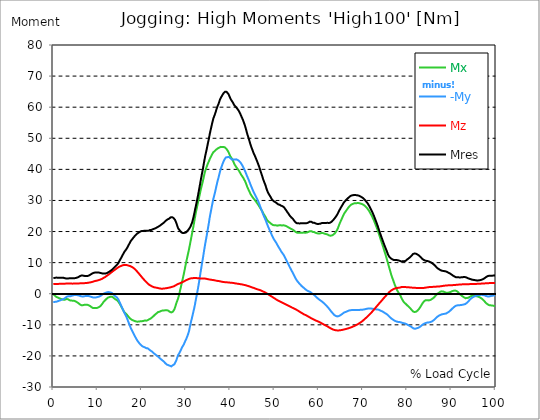
| Category |  Mx |  -My |  Mz |  Mres |
|---|---|---|---|---|
| 0.0 | -0.159 | -2.623 | 3.1 | 5.008 |
| 0.167348456675344 | -0.397 | -2.623 | 3.1 | 5.055 |
| 0.334696913350688 | -0.62 | -2.623 | 3.116 | 5.103 |
| 0.5020453700260321 | -0.827 | -2.607 | 3.132 | 5.167 |
| 0.669393826701376 | -1.017 | -2.575 | 3.132 | 5.198 |
| 0.83674228337672 | -1.145 | -2.496 | 3.148 | 5.167 |
| 1.0040907400520642 | -1.224 | -2.4 | 3.148 | 5.135 |
| 1.1621420602454444 | -1.335 | -2.321 | 3.164 | 5.135 |
| 1.3294905169207885 | -1.463 | -2.242 | 3.179 | 5.151 |
| 1.4968389735961325 | -1.542 | -2.146 | 3.179 | 5.151 |
| 1.6641874302714765 | -1.637 | -2.067 | 3.195 | 5.135 |
| 1.8315358869468206 | -1.717 | -1.971 | 3.195 | 5.135 |
| 1.9988843436221646 | -1.812 | -1.876 | 3.195 | 5.119 |
| 2.1662328002975086 | -1.892 | -1.765 | 3.211 | 5.103 |
| 2.333581256972853 | -1.924 | -1.653 | 3.227 | 5.103 |
| 2.5009297136481967 | -1.939 | -1.542 | 3.227 | 5.071 |
| 2.6682781703235405 | -1.892 | -1.399 | 3.243 | 4.976 |
| 2.8356266269988843 | -1.749 | -1.16 | 3.259 | 4.896 |
| 3.002975083674229 | -1.685 | -0.986 | 3.275 | 4.865 |
| 3.1703235403495724 | -1.717 | -0.89 | 3.275 | 4.88 |
| 3.337671997024917 | -1.78 | -0.827 | 3.275 | 4.896 |
| 3.4957233172182973 | -1.892 | -0.795 | 3.275 | 4.928 |
| 3.663071773893641 | -2.098 | -0.843 | 3.275 | 4.992 |
| 3.8304202305689854 | -2.21 | -0.811 | 3.275 | 5.024 |
| 3.997768687244329 | -2.21 | -0.731 | 3.275 | 4.992 |
| 4.165117143919673 | -2.242 | -0.684 | 3.259 | 4.992 |
| 4.332465600595017 | -2.226 | -0.572 | 3.243 | 4.976 |
| 4.499814057270361 | -2.226 | -0.493 | 3.243 | 4.96 |
| 4.667162513945706 | -2.257 | -0.445 | 3.259 | 4.976 |
| 4.834510970621049 | -2.337 | -0.413 | 3.275 | 5.008 |
| 5.001859427296393 | -2.448 | -0.413 | 3.275 | 5.039 |
| 5.169207883971737 | -2.575 | -0.413 | 3.291 | 5.103 |
| 5.336556340647081 | -2.718 | -0.445 | 3.291 | 5.167 |
| 5.503904797322425 | -2.846 | -0.477 | 3.307 | 5.246 |
| 5.671253253997769 | -3.02 | -0.525 | 3.307 | 5.357 |
| 5.82930457419115 | -3.227 | -0.604 | 3.323 | 5.516 |
| 5.996653030866494 | -3.45 | -0.684 | 3.338 | 5.675 |
| 6.164001487541838 | -3.609 | -0.779 | 3.354 | 5.787 |
| 6.331349944217181 | -3.688 | -0.843 | 3.37 | 5.85 |
| 6.498698400892526 | -3.704 | -0.874 | 3.37 | 5.866 |
| 6.66604685756787 | -3.688 | -0.89 | 3.386 | 5.85 |
| 6.833395314243213 | -3.64 | -0.874 | 3.402 | 5.818 |
| 7.000743770918558 | -3.561 | -0.811 | 3.402 | 5.739 |
| 7.168092227593902 | -3.513 | -0.747 | 3.418 | 5.675 |
| 7.335440684269246 | -3.513 | -0.731 | 3.434 | 5.675 |
| 7.50278914094459 | -3.529 | -0.747 | 3.45 | 5.691 |
| 7.6701375976199335 | -3.545 | -0.731 | 3.481 | 5.691 |
| 7.837486054295278 | -3.609 | -0.747 | 3.513 | 5.739 |
| 7.995537374488658 | -3.72 | -0.763 | 3.561 | 5.834 |
| 8.162885831164003 | -3.831 | -0.795 | 3.593 | 5.946 |
| 8.330234287839346 | -3.974 | -0.874 | 3.64 | 6.105 |
| 8.49758274451469 | -4.149 | -0.97 | 3.688 | 6.264 |
| 8.664931201190035 | -4.356 | -1.065 | 3.752 | 6.407 |
| 8.832279657865378 | -4.531 | -1.16 | 3.815 | 6.55 |
| 8.999628114540721 | -4.626 | -1.192 | 3.895 | 6.661 |
| 9.166976571216066 | -4.626 | -1.176 | 3.974 | 6.74 |
| 9.334325027891412 | -4.61 | -1.176 | 4.054 | 6.788 |
| 9.501673484566755 | -4.61 | -1.192 | 4.117 | 6.804 |
| 9.669021941242098 | -4.626 | -1.176 | 4.165 | 6.836 |
| 9.836370397917442 | -4.594 | -1.129 | 4.213 | 6.852 |
| 10.003718854592787 | -4.515 | -1.065 | 4.26 | 6.836 |
| 10.17106731126813 | -4.372 | -1.002 | 4.34 | 6.82 |
| 10.329118631461512 | -4.276 | -0.938 | 4.419 | 6.788 |
| 10.496467088136853 | -4.133 | -0.827 | 4.483 | 6.74 |
| 10.663815544812199 | -3.943 | -0.684 | 4.578 | 6.677 |
| 10.831164001487544 | -3.656 | -0.525 | 4.674 | 6.613 |
| 10.998512458162887 | -3.354 | -0.35 | 4.785 | 6.55 |
| 11.16586091483823 | -3.02 | -0.175 | 4.912 | 6.502 |
| 11.333209371513574 | -2.655 | 0 | 5.071 | 6.47 |
| 11.50055782818892 | -2.4 | 0.095 | 5.198 | 6.47 |
| 11.667906284864264 | -2.146 | 0.207 | 5.341 | 6.47 |
| 11.835254741539607 | -1.908 | 0.302 | 5.5 | 6.518 |
| 12.00260319821495 | -1.669 | 0.397 | 5.675 | 6.597 |
| 12.169951654890292 | -1.463 | 0.477 | 5.834 | 6.709 |
| 12.337300111565641 | -1.272 | 0.525 | 6.009 | 6.82 |
| 12.504648568240984 | -1.176 | 0.509 | 6.168 | 6.963 |
| 12.662699888434362 | -1.065 | 0.509 | 6.359 | 7.106 |
| 12.830048345109708 | -0.986 | 0.461 | 6.534 | 7.249 |
| 12.997396801785053 | -0.97 | 0.366 | 6.725 | 7.424 |
| 13.164745258460396 | -0.922 | 0.27 | 6.915 | 7.615 |
| 13.33209371513574 | -0.986 | 0.127 | 7.106 | 7.821 |
| 13.499442171811083 | -1.16 | -0.064 | 7.281 | 8.044 |
| 13.666790628486426 | -1.383 | -0.318 | 7.456 | 8.282 |
| 13.834139085161771 | -1.59 | -0.572 | 7.615 | 8.537 |
| 14.001487541837117 | -1.765 | -0.795 | 7.79 | 8.775 |
| 14.16883599851246 | -1.908 | -0.97 | 7.965 | 9.014 |
| 14.336184455187803 | -2.035 | -1.145 | 8.155 | 9.22 |
| 14.503532911863147 | -2.226 | -1.399 | 8.33 | 9.475 |
| 14.670881368538492 | -2.512 | -1.765 | 8.489 | 9.793 |
| 14.828932688731873 | -2.862 | -2.273 | 8.616 | 10.254 |
| 14.996281145407215 | -3.211 | -2.782 | 8.743 | 10.715 |
| 15.163629602082558 | -3.64 | -3.307 | 8.871 | 11.128 |
| 15.330978058757903 | -4.086 | -3.847 | 8.95 | 11.557 |
| 15.498326515433247 | -4.515 | -4.372 | 9.046 | 12.018 |
| 15.665674972108594 | -4.96 | -4.912 | 9.141 | 12.448 |
| 15.833023428783937 | -5.421 | -5.437 | 9.22 | 12.893 |
| 16.00037188545928 | -5.866 | -5.977 | 9.268 | 13.338 |
| 16.167720342134626 | -6.168 | -6.47 | 9.284 | 13.688 |
| 16.335068798809967 | -6.359 | -6.884 | 9.268 | 13.974 |
| 16.502417255485312 | -6.581 | -7.392 | 9.236 | 14.323 |
| 16.669765712160658 | -6.836 | -7.965 | 9.189 | 14.721 |
| 16.837114168836 | -7.138 | -8.585 | 9.125 | 15.15 |
| 17.004462625511344 | -7.424 | -9.205 | 9.046 | 15.595 |
| 17.16251394570472 | -7.71 | -9.825 | 8.982 | 16.056 |
| 17.32986240238007 | -7.965 | -10.429 | 8.902 | 16.501 |
| 17.497210859055414 | -8.187 | -11.033 | 8.807 | 16.931 |
| 17.664559315730756 | -8.314 | -11.51 | 8.68 | 17.233 |
| 17.8319077724061 | -8.426 | -11.987 | 8.569 | 17.551 |
| 17.999256229081443 | -8.553 | -12.463 | 8.41 | 17.869 |
| 18.166604685756788 | -8.68 | -12.94 | 8.235 | 18.155 |
| 18.333953142432133 | -8.759 | -13.433 | 8.044 | 18.457 |
| 18.501301599107478 | -8.823 | -13.862 | 7.821 | 18.711 |
| 18.668650055782823 | -8.902 | -14.276 | 7.567 | 18.965 |
| 18.835998512458165 | -8.966 | -14.705 | 7.313 | 19.204 |
| 19.00334696913351 | -8.998 | -15.102 | 7.042 | 19.411 |
| 19.170695425808855 | -8.934 | -15.42 | 6.788 | 19.554 |
| 19.338043882484197 | -8.934 | -15.754 | 6.486 | 19.728 |
| 19.496095202677576 | -8.902 | -16.04 | 6.2 | 19.872 |
| 19.66344365935292 | -8.871 | -16.311 | 5.914 | 20.015 |
| 19.830792116028263 | -8.855 | -16.549 | 5.628 | 20.126 |
| 19.998140572703612 | -8.855 | -16.756 | 5.341 | 20.205 |
| 20.165489029378953 | -8.807 | -16.883 | 5.071 | 20.205 |
| 20.3328374860543 | -8.759 | -17.058 | 4.785 | 20.253 |
| 20.500185942729644 | -8.664 | -17.137 | 4.515 | 20.221 |
| 20.667534399404985 | -8.616 | -17.233 | 4.26 | 20.205 |
| 20.83488285608033 | -8.664 | -17.376 | 4.006 | 20.285 |
| 21.002231312755672 | -8.664 | -17.503 | 3.768 | 20.348 |
| 21.16957976943102 | -8.6 | -17.535 | 3.513 | 20.285 |
| 21.336928226106362 | -8.505 | -17.566 | 3.291 | 20.237 |
| 21.504276682781704 | -8.362 | -17.741 | 3.068 | 20.269 |
| 21.67162513945705 | -8.203 | -17.948 | 2.877 | 20.348 |
| 21.82967645965043 | -8.092 | -18.186 | 2.75 | 20.492 |
| 21.997024916325774 | -7.965 | -18.33 | 2.607 | 20.555 |
| 22.16437337300112 | -7.806 | -18.409 | 2.464 | 20.523 |
| 22.33172182967646 | -7.599 | -18.616 | 2.337 | 20.603 |
| 22.499070286351806 | -7.376 | -18.918 | 2.226 | 20.746 |
| 22.666418743027148 | -7.17 | -19.108 | 2.13 | 20.841 |
| 22.833767199702496 | -6.947 | -19.299 | 2.051 | 20.921 |
| 23.00111565637784 | -6.693 | -19.474 | 2.003 | 21 |
| 23.168464113053183 | -6.518 | -19.649 | 1.971 | 21.112 |
| 23.335812569728528 | -6.327 | -19.84 | 1.939 | 21.239 |
| 23.50316102640387 | -6.089 | -20.094 | 1.908 | 21.398 |
| 23.670509483079215 | -5.914 | -20.221 | 1.828 | 21.461 |
| 23.83785793975456 | -5.866 | -20.444 | 1.765 | 21.652 |
| 23.995909259947936 | -5.787 | -20.666 | 1.701 | 21.843 |
| 24.163257716623285 | -5.659 | -20.841 | 1.653 | 21.97 |
| 24.330606173298627 | -5.548 | -21.064 | 1.637 | 22.161 |
| 24.49795462997397 | -5.469 | -21.271 | 1.622 | 22.336 |
| 24.665303086649313 | -5.405 | -21.461 | 1.622 | 22.511 |
| 24.83265154332466 | -5.389 | -21.652 | 1.637 | 22.685 |
| 25.0 | -5.373 | -21.843 | 1.685 | 22.86 |
| 25.167348456675345 | -5.357 | -22.097 | 1.701 | 23.115 |
| 25.334696913350694 | -5.326 | -22.383 | 1.733 | 23.369 |
| 25.502045370026035 | -5.294 | -22.59 | 1.765 | 23.576 |
| 25.669393826701377 | -5.294 | -22.781 | 1.812 | 23.782 |
| 25.836742283376722 | -5.357 | -22.892 | 1.86 | 23.925 |
| 26.004090740052067 | -5.453 | -22.972 | 1.908 | 24.037 |
| 26.17143919672741 | -5.644 | -22.987 | 1.955 | 24.132 |
| 26.329490516920792 | -5.834 | -23.162 | 2.003 | 24.355 |
| 26.49683897359613 | -5.93 | -23.289 | 2.067 | 24.561 |
| 26.66418743027148 | -6.009 | -23.369 | 2.146 | 24.657 |
| 26.831535886946828 | -6.025 | -23.274 | 2.21 | 24.625 |
| 26.998884343622166 | -5.802 | -22.987 | 2.273 | 24.402 |
| 27.166232800297514 | -5.58 | -22.924 | 2.369 | 24.37 |
| 27.333581256972852 | -5.103 | -22.733 | 2.448 | 24.164 |
| 27.5009297136482 | -4.451 | -22.272 | 2.591 | 23.766 |
| 27.668278170323543 | -3.704 | -21.827 | 2.734 | 23.242 |
| 27.835626626998888 | -2.941 | -21.302 | 2.893 | 22.654 |
| 28.002975083674233 | -2.305 | -20.555 | 3.005 | 21.906 |
| 28.170323540349575 | -1.685 | -19.824 | 3.116 | 21.175 |
| 28.33767199702492 | -0.858 | -19.442 | 3.211 | 20.81 |
| 28.50502045370026 | 0.079 | -19.061 | 3.291 | 20.492 |
| 28.663071773893645 | 1.176 | -18.6 | 3.402 | 20.19 |
| 28.830420230568986 | 2.146 | -18.107 | 3.481 | 19.887 |
| 28.99776868724433 | 3.259 | -17.566 | 3.609 | 19.681 |
| 29.165117143919673 | 4.276 | -17.042 | 3.736 | 19.474 |
| 29.33246560059502 | 5.278 | -16.708 | 3.815 | 19.506 |
| 29.499814057270367 | 6.407 | -16.263 | 3.943 | 19.538 |
| 29.66716251394571 | 7.535 | -15.738 | 4.07 | 19.585 |
| 29.834510970621054 | 8.743 | -15.198 | 4.213 | 19.617 |
| 30.00185942729639 | 9.936 | -14.689 | 4.34 | 19.728 |
| 30.169207883971744 | 11.017 | -14.101 | 4.435 | 19.983 |
| 30.33655634064708 | 12.13 | -13.513 | 4.547 | 20.237 |
| 30.50390479732243 | 13.195 | -12.829 | 4.658 | 20.507 |
| 30.671253253997772 | 14.276 | -12.05 | 4.753 | 20.81 |
| 30.829304574191156 | 15.5 | -10.906 | 4.849 | 21.112 |
| 30.996653030866494 | 16.708 | -9.809 | 4.912 | 21.588 |
| 31.164001487541842 | 17.948 | -8.743 | 4.96 | 22.208 |
| 31.331349944217187 | 19.22 | -7.821 | 4.992 | 22.749 |
| 31.498698400892525 | 20.428 | -6.788 | 5.008 | 23.544 |
| 31.666046857567874 | 21.652 | -5.739 | 5.024 | 24.529 |
| 31.833395314243212 | 22.987 | -4.737 | 5.055 | 25.595 |
| 32.00074377091856 | 24.402 | -3.609 | 5.071 | 26.787 |
| 32.1680922275939 | 25.722 | -2.273 | 5.055 | 27.868 |
| 32.33544068426925 | 26.898 | -1.049 | 5.039 | 28.997 |
| 32.50278914094459 | 28.043 | 0.207 | 5.008 | 30.125 |
| 32.670137597619934 | 29.092 | 1.447 | 4.976 | 31.333 |
| 32.83748605429528 | 30.173 | 2.846 | 4.96 | 32.621 |
| 33.004834510970625 | 31.254 | 4.26 | 4.944 | 33.909 |
| 33.162885831164004 | 32.399 | 5.818 | 4.928 | 35.244 |
| 33.33023428783935 | 33.496 | 7.345 | 4.912 | 36.58 |
| 33.497582744514695 | 34.481 | 8.791 | 4.88 | 37.851 |
| 33.664931201190036 | 35.435 | 10.238 | 4.865 | 39.107 |
| 33.83227965786538 | 36.389 | 11.589 | 4.865 | 40.284 |
| 33.99962811454073 | 37.518 | 13.115 | 4.865 | 41.714 |
| 34.16697657121607 | 38.583 | 14.641 | 4.865 | 43.066 |
| 34.33432502789141 | 39.489 | 16.04 | 4.865 | 44.29 |
| 34.50167348456676 | 40.188 | 17.344 | 4.833 | 45.387 |
| 34.6690219412421 | 40.84 | 18.632 | 4.769 | 46.468 |
| 34.83637039791744 | 41.508 | 20.062 | 4.721 | 47.66 |
| 35.00371885459279 | 42.096 | 21.398 | 4.658 | 48.773 |
| 35.17106731126814 | 42.589 | 22.797 | 4.594 | 49.87 |
| 35.338415767943474 | 43.209 | 24.37 | 4.578 | 51.173 |
| 35.49646708813686 | 43.702 | 25.674 | 4.547 | 52.302 |
| 35.6638155448122 | 44.163 | 26.882 | 4.499 | 53.335 |
| 35.831164001487544 | 44.655 | 28.09 | 4.451 | 54.384 |
| 35.998512458162885 | 45.116 | 29.299 | 4.419 | 55.402 |
| 36.165860914838234 | 45.514 | 30.475 | 4.388 | 56.34 |
| 36.333209371513576 | 45.72 | 31.365 | 4.356 | 56.96 |
| 36.50055782818892 | 45.895 | 32.319 | 4.308 | 57.612 |
| 36.667906284864266 | 46.07 | 33.337 | 4.245 | 58.295 |
| 36.83525474153961 | 46.372 | 34.418 | 4.197 | 59.106 |
| 37.002603198214956 | 46.611 | 35.451 | 4.149 | 59.821 |
| 37.1699516548903 | 46.738 | 36.468 | 4.117 | 60.489 |
| 37.337300111565646 | 46.817 | 37.263 | 4.086 | 60.982 |
| 37.50464856824098 | 46.992 | 38.265 | 4.038 | 61.713 |
| 37.66269988843437 | 47.135 | 39.219 | 4.006 | 62.397 |
| 37.83004834510971 | 47.231 | 40.029 | 3.958 | 62.937 |
| 37.99739680178505 | 47.215 | 40.729 | 3.879 | 63.366 |
| 38.16474525846039 | 47.199 | 41.396 | 3.831 | 63.764 |
| 38.33209371513574 | 47.215 | 42.048 | 3.799 | 64.193 |
| 38.49944217181109 | 47.199 | 42.605 | 3.768 | 64.527 |
| 38.666790628486424 | 47.119 | 43.113 | 3.736 | 64.797 |
| 38.83413908516178 | 47.024 | 43.479 | 3.704 | 64.972 |
| 39.001487541837115 | 46.849 | 43.813 | 3.672 | 65.067 |
| 39.16883599851246 | 46.531 | 43.956 | 3.672 | 64.924 |
| 39.336184455187805 | 46.166 | 43.924 | 3.656 | 64.606 |
| 39.503532911863154 | 45.816 | 44.019 | 3.64 | 64.384 |
| 39.670881368538495 | 45.355 | 44.004 | 3.625 | 64.018 |
| 39.83822982521384 | 44.783 | 43.829 | 3.577 | 63.446 |
| 39.996281145407224 | 44.242 | 43.622 | 3.545 | 62.89 |
| 40.163629602082565 | 43.861 | 43.352 | 3.513 | 62.429 |
| 40.33097805875791 | 43.527 | 43.193 | 3.513 | 62.047 |
| 40.498326515433256 | 43.113 | 43.129 | 3.497 | 61.681 |
| 40.6656749721086 | 42.573 | 43.209 | 3.466 | 61.3 |
| 40.83302342878393 | 42.016 | 43.161 | 3.418 | 60.839 |
| 41.00037188545929 | 41.54 | 43.161 | 3.37 | 60.473 |
| 41.16772034213463 | 41.11 | 43.241 | 3.323 | 60.219 |
| 41.33506879880997 | 40.776 | 43.225 | 3.275 | 59.949 |
| 41.50241725548531 | 40.443 | 43.161 | 3.259 | 59.662 |
| 41.66976571216066 | 40.125 | 43.034 | 3.227 | 59.36 |
| 41.837114168836 | 39.823 | 42.875 | 3.179 | 59.011 |
| 42.004462625511344 | 39.457 | 42.684 | 3.132 | 58.613 |
| 42.17181108218669 | 39.028 | 42.446 | 3.1 | 58.136 |
| 42.32986240238007 | 38.614 | 42.16 | 3.068 | 57.643 |
| 42.497210859055414 | 38.185 | 41.794 | 3.036 | 57.071 |
| 42.66455931573076 | 37.867 | 41.396 | 2.989 | 56.547 |
| 42.831907772406105 | 37.518 | 40.999 | 2.941 | 56.022 |
| 42.999256229081446 | 37.136 | 40.506 | 2.877 | 55.386 |
| 43.16660468575679 | 36.659 | 39.997 | 2.83 | 54.687 |
| 43.33395314243214 | 36.246 | 39.489 | 2.782 | 54.019 |
| 43.50130159910748 | 35.658 | 38.885 | 2.734 | 53.176 |
| 43.66865005578282 | 35.038 | 38.312 | 2.655 | 52.318 |
| 43.83599851245817 | 34.386 | 37.708 | 2.575 | 51.428 |
| 44.00334696913351 | 33.845 | 37.184 | 2.496 | 50.68 |
| 44.17069542580886 | 33.337 | 36.611 | 2.416 | 49.917 |
| 44.3380438824842 | 32.828 | 36.023 | 2.353 | 49.123 |
| 44.49609520267758 | 32.319 | 35.387 | 2.273 | 48.312 |
| 44.66344365935292 | 31.842 | 34.783 | 2.178 | 47.565 |
| 44.83079211602827 | 31.477 | 34.227 | 2.067 | 46.913 |
| 44.99814057270361 | 31.175 | 33.639 | 1.987 | 46.293 |
| 45.16548902937895 | 30.809 | 33.082 | 1.924 | 45.641 |
| 45.332837486054295 | 30.491 | 32.589 | 1.86 | 45.053 |
| 45.500185942729644 | 30.237 | 32.112 | 1.749 | 44.544 |
| 45.66753439940499 | 29.935 | 31.651 | 1.669 | 44.004 |
| 45.83488285608033 | 29.601 | 31.175 | 1.574 | 43.415 |
| 46.00223131275568 | 29.267 | 30.682 | 1.478 | 42.827 |
| 46.16957976943102 | 28.933 | 30.173 | 1.399 | 42.239 |
| 46.336928226106366 | 28.567 | 29.648 | 1.335 | 41.603 |
| 46.50427668278171 | 28.202 | 29.092 | 1.256 | 40.967 |
| 46.671625139457056 | 27.82 | 28.456 | 1.192 | 40.236 |
| 46.829676459650436 | 27.423 | 27.788 | 1.113 | 39.489 |
| 46.99702491632577 | 27.105 | 27.153 | 1.017 | 38.789 |
| 47.16437337300112 | 26.691 | 26.533 | 0.906 | 38.058 |
| 47.33172182967646 | 26.215 | 25.897 | 0.779 | 37.295 |
| 47.49907028635181 | 25.769 | 25.293 | 0.684 | 36.58 |
| 47.66641874302716 | 25.372 | 24.72 | 0.556 | 35.928 |
| 47.83376719970249 | 25.006 | 24.212 | 0.445 | 35.355 |
| 48.001115656377834 | 24.577 | 23.671 | 0.318 | 34.72 |
| 48.16846411305319 | 24.068 | 23.019 | 0.159 | 33.909 |
| 48.33581256972853 | 23.655 | 22.383 | 0.032 | 33.209 |
| 48.50316102640387 | 23.369 | 21.779 | -0.111 | 32.653 |
| 48.67050948307921 | 23.178 | 21.223 | -0.254 | 32.192 |
| 48.837857939754564 | 22.987 | 20.682 | -0.413 | 31.779 |
| 49.005206396429905 | 22.813 | 20.158 | -0.572 | 31.397 |
| 49.163257716623285 | 22.606 | 19.617 | -0.715 | 30.984 |
| 49.33060617329863 | 22.383 | 19.061 | -0.874 | 30.539 |
| 49.49795462997397 | 22.224 | 18.536 | -1.017 | 30.173 |
| 49.66530308664932 | 22.097 | 18.043 | -1.176 | 29.919 |
| 49.832651543324666 | 22.018 | 17.614 | -1.335 | 29.744 |
| 50.0 | 22.002 | 17.217 | -1.478 | 29.601 |
| 50.16734845667534 | 22.002 | 16.851 | -1.637 | 29.474 |
| 50.33469691335069 | 22.002 | 16.533 | -1.796 | 29.362 |
| 50.50204537002604 | 21.938 | 16.136 | -1.955 | 29.14 |
| 50.66939382670139 | 21.891 | 15.659 | -2.098 | 28.901 |
| 50.836742283376715 | 21.891 | 15.23 | -2.21 | 28.726 |
| 51.00409074005207 | 22.002 | 14.848 | -2.337 | 28.679 |
| 51.17143919672741 | 22.034 | 14.451 | -2.448 | 28.615 |
| 51.32949051692079 | 22.065 | 14.085 | -2.575 | 28.567 |
| 51.496838973596134 | 21.97 | 13.624 | -2.687 | 28.313 |
| 51.66418743027148 | 21.954 | 13.29 | -2.814 | 28.202 |
| 51.831535886946824 | 22.018 | 12.972 | -2.925 | 28.122 |
| 51.99888434362217 | 22.018 | 12.622 | -3.052 | 27.963 |
| 52.16623280029752 | 22.018 | 12.257 | -3.164 | 27.788 |
| 52.33358125697285 | 21.922 | 11.732 | -3.291 | 27.423 |
| 52.5009297136482 | 21.859 | 11.303 | -3.402 | 27.137 |
| 52.668278170323546 | 21.732 | 10.81 | -3.529 | 26.771 |
| 52.835626626998895 | 21.588 | 10.333 | -3.64 | 26.374 |
| 53.00297508367424 | 21.477 | 9.904 | -3.752 | 26.071 |
| 53.17032354034958 | 21.35 | 9.427 | -3.879 | 25.738 |
| 53.33767199702492 | 21.191 | 8.887 | -3.99 | 25.356 |
| 53.50502045370027 | 21.032 | 8.41 | -4.101 | 25.022 |
| 53.663071773893655 | 20.921 | 7.949 | -4.229 | 24.752 |
| 53.83042023056899 | 20.794 | 7.488 | -4.356 | 24.498 |
| 53.99776868724433 | 20.698 | 7.074 | -4.483 | 24.291 |
| 54.16511714391967 | 20.587 | 6.661 | -4.594 | 24.068 |
| 54.33246560059503 | 20.396 | 6.152 | -4.706 | 23.719 |
| 54.49981405727037 | 20.253 | 5.707 | -4.801 | 23.448 |
| 54.667162513945705 | 19.999 | 5.214 | -4.944 | 23.099 |
| 54.834510970621054 | 19.808 | 4.769 | -5.071 | 22.844 |
| 55.0018594272964 | 19.681 | 4.388 | -5.183 | 22.701 |
| 55.169207883971744 | 19.617 | 4.054 | -5.326 | 22.654 |
| 55.336556340647086 | 19.585 | 3.736 | -5.469 | 22.638 |
| 55.50390479732243 | 19.57 | 3.466 | -5.628 | 22.606 |
| 55.671253253997776 | 19.585 | 3.195 | -5.771 | 22.622 |
| 55.83860171067312 | 19.649 | 2.941 | -5.914 | 22.654 |
| 55.9966530308665 | 19.649 | 2.671 | -6.057 | 22.638 |
| 56.16400148754184 | 19.633 | 2.432 | -6.2 | 22.622 |
| 56.33134994421718 | 19.633 | 2.21 | -6.343 | 22.638 |
| 56.498698400892536 | 19.665 | 2.035 | -6.502 | 22.669 |
| 56.66604685756788 | 19.665 | 1.812 | -6.629 | 22.654 |
| 56.83339531424321 | 19.649 | 1.622 | -6.74 | 22.669 |
| 57.00074377091856 | 19.617 | 1.431 | -6.852 | 22.654 |
| 57.16809222759391 | 19.633 | 1.208 | -6.963 | 22.669 |
| 57.33544068426925 | 19.697 | 1.033 | -7.09 | 22.717 |
| 57.5027891409446 | 19.744 | 0.906 | -7.233 | 22.765 |
| 57.670137597619934 | 19.872 | 0.827 | -7.36 | 22.908 |
| 57.83748605429528 | 20.015 | 0.731 | -7.504 | 23.083 |
| 58.004834510970625 | 20.126 | 0.62 | -7.631 | 23.194 |
| 58.16288583116401 | 20.19 | 0.477 | -7.758 | 23.242 |
| 58.330234287839346 | 20.126 | 0.223 | -7.901 | 23.131 |
| 58.497582744514695 | 20.015 | 0.064 | -8.028 | 23.019 |
| 58.66493120119004 | 19.872 | -0.127 | -8.155 | 22.828 |
| 58.832279657865385 | 19.856 | -0.254 | -8.267 | 22.828 |
| 58.999628114540734 | 19.808 | -0.397 | -8.394 | 22.813 |
| 59.16697657121607 | 19.713 | -0.636 | -8.505 | 22.717 |
| 59.33432502789142 | 19.585 | -0.906 | -8.616 | 22.574 |
| 59.50167348456676 | 19.506 | -1.129 | -8.712 | 22.511 |
| 59.66902194124211 | 19.426 | -1.335 | -8.807 | 22.463 |
| 59.83637039791745 | 19.379 | -1.558 | -8.918 | 22.463 |
| 60.00371885459278 | 19.363 | -1.749 | -9.014 | 22.463 |
| 60.17106731126813 | 19.363 | -1.924 | -9.125 | 22.463 |
| 60.33841576794349 | 19.411 | -2.114 | -9.252 | 22.511 |
| 60.49646708813685 | 19.474 | -2.273 | -9.379 | 22.606 |
| 60.6638155448122 | 19.538 | -2.4 | -9.522 | 22.717 |
| 60.831164001487544 | 19.538 | -2.623 | -9.65 | 22.781 |
| 60.99851245816289 | 19.49 | -2.83 | -9.777 | 22.781 |
| 61.16586091483824 | 19.411 | -3.036 | -9.904 | 22.749 |
| 61.333209371513576 | 19.315 | -3.259 | -10.031 | 22.733 |
| 61.50055782818892 | 19.252 | -3.481 | -10.158 | 22.749 |
| 61.667906284864266 | 19.204 | -3.72 | -10.286 | 22.781 |
| 61.835254741539615 | 19.156 | -3.974 | -10.413 | 22.813 |
| 62.002603198214956 | 19.029 | -4.245 | -10.54 | 22.797 |
| 62.16995165489029 | 18.918 | -4.531 | -10.683 | 22.781 |
| 62.33730011156564 | 18.775 | -4.817 | -10.826 | 22.765 |
| 62.504648568240995 | 18.663 | -5.119 | -10.985 | 22.797 |
| 62.67199702491633 | 18.663 | -5.421 | -11.112 | 22.908 |
| 62.83004834510971 | 18.663 | -5.755 | -11.239 | 23.067 |
| 62.99739680178505 | 18.759 | -6.009 | -11.351 | 23.274 |
| 63.1647452584604 | 18.87 | -6.264 | -11.462 | 23.512 |
| 63.33209371513575 | 19.029 | -6.581 | -11.557 | 23.798 |
| 63.4994421718111 | 19.22 | -6.836 | -11.637 | 24.068 |
| 63.666790628486424 | 19.474 | -6.995 | -11.7 | 24.37 |
| 63.83413908516177 | 19.792 | -7.122 | -11.748 | 24.688 |
| 64.00148754183712 | 20.158 | -7.233 | -11.78 | 25.038 |
| 64.16883599851248 | 20.539 | -7.297 | -11.812 | 25.404 |
| 64.3361844551878 | 21.064 | -7.281 | -11.828 | 25.849 |
| 64.50353291186315 | 21.716 | -7.201 | -11.812 | 26.358 |
| 64.6708813685385 | 22.336 | -7.106 | -11.78 | 26.835 |
| 64.83822982521384 | 22.908 | -6.979 | -11.748 | 27.264 |
| 65.00557828188919 | 23.433 | -6.82 | -11.716 | 27.677 |
| 65.16362960208257 | 23.957 | -6.661 | -11.684 | 28.09 |
| 65.3309780587579 | 24.466 | -6.486 | -11.637 | 28.472 |
| 65.49832651543326 | 25.038 | -6.295 | -11.573 | 28.901 |
| 65.6656749721086 | 25.547 | -6.12 | -11.51 | 29.299 |
| 65.83302342878395 | 25.944 | -5.977 | -11.462 | 29.569 |
| 66.00037188545929 | 26.294 | -5.898 | -11.398 | 29.855 |
| 66.16772034213463 | 26.628 | -5.818 | -11.335 | 30.093 |
| 66.33506879880998 | 26.962 | -5.723 | -11.271 | 30.332 |
| 66.50241725548531 | 27.311 | -5.596 | -11.192 | 30.586 |
| 66.66976571216065 | 27.645 | -5.485 | -11.128 | 30.809 |
| 66.83711416883601 | 27.931 | -5.405 | -11.049 | 31.031 |
| 67.00446262551135 | 28.202 | -5.357 | -10.969 | 31.238 |
| 67.1718110821867 | 28.456 | -5.294 | -10.906 | 31.429 |
| 67.32986240238007 | 28.647 | -5.278 | -10.81 | 31.556 |
| 67.49721085905541 | 28.774 | -5.262 | -10.715 | 31.636 |
| 67.66455931573076 | 28.869 | -5.23 | -10.603 | 31.667 |
| 67.83190777240611 | 28.981 | -5.198 | -10.524 | 31.731 |
| 67.99925622908145 | 29.06 | -5.214 | -10.413 | 31.763 |
| 68.16660468575678 | 29.076 | -5.23 | -10.317 | 31.763 |
| 68.33395314243214 | 29.108 | -5.214 | -10.19 | 31.731 |
| 68.50130159910749 | 29.108 | -5.198 | -10.063 | 31.683 |
| 68.66865005578282 | 29.14 | -5.214 | -9.936 | 31.667 |
| 68.83599851245816 | 29.14 | -5.214 | -9.793 | 31.62 |
| 69.00334696913352 | 29.156 | -5.214 | -9.666 | 31.572 |
| 69.17069542580886 | 29.14 | -5.214 | -9.522 | 31.508 |
| 69.3380438824842 | 29.06 | -5.183 | -9.348 | 31.365 |
| 69.50539233915956 | 28.981 | -5.167 | -9.189 | 31.238 |
| 69.66344365935292 | 28.901 | -5.151 | -9.03 | 31.095 |
| 69.83079211602826 | 28.822 | -5.135 | -8.855 | 30.952 |
| 69.99814057270362 | 28.71 | -5.103 | -8.664 | 30.777 |
| 70.16548902937896 | 28.536 | -5.087 | -8.457 | 30.555 |
| 70.33283748605429 | 28.377 | -5.024 | -8.219 | 30.332 |
| 70.50018594272964 | 28.186 | -4.976 | -7.996 | 30.093 |
| 70.667534399405 | 27.931 | -4.912 | -7.806 | 29.791 |
| 70.83488285608033 | 27.677 | -4.849 | -7.599 | 29.489 |
| 71.00223131275568 | 27.407 | -4.785 | -7.376 | 29.171 |
| 71.16957976943102 | 27.073 | -4.769 | -7.154 | 28.822 |
| 71.33692822610637 | 26.739 | -4.737 | -6.915 | 28.424 |
| 71.50427668278171 | 26.358 | -4.737 | -6.677 | 28.011 |
| 71.67162513945706 | 25.944 | -4.753 | -6.438 | 27.566 |
| 71.8389735961324 | 25.483 | -4.769 | -6.184 | 27.073 |
| 71.99702491632577 | 25.022 | -4.785 | -5.914 | 26.564 |
| 72.16437337300113 | 24.545 | -4.833 | -5.659 | 26.071 |
| 72.33172182967647 | 24.021 | -4.865 | -5.373 | 25.515 |
| 72.49907028635181 | 23.496 | -4.896 | -5.103 | 24.959 |
| 72.66641874302715 | 22.908 | -4.944 | -4.817 | 24.339 |
| 72.8337671997025 | 22.288 | -4.976 | -4.531 | 23.719 |
| 73.00111565637783 | 21.684 | -5.024 | -4.245 | 23.099 |
| 73.16846411305319 | 21.064 | -5.071 | -3.958 | 22.479 |
| 73.33581256972853 | 20.396 | -5.087 | -3.688 | 21.795 |
| 73.50316102640387 | 19.681 | -5.119 | -3.418 | 21.064 |
| 73.67050948307921 | 18.95 | -5.23 | -3.132 | 20.333 |
| 73.83785793975457 | 18.234 | -5.357 | -2.877 | 19.649 |
| 74.00520639642991 | 17.503 | -5.453 | -2.607 | 18.95 |
| 74.16325771662328 | 16.772 | -5.564 | -2.337 | 18.266 |
| 74.33060617329863 | 16.088 | -5.659 | -2.067 | 17.63 |
| 74.49795462997398 | 15.373 | -5.771 | -1.78 | 16.978 |
| 74.66530308664932 | 14.562 | -5.93 | -1.478 | 16.311 |
| 74.83265154332466 | 13.783 | -6.089 | -1.208 | 15.691 |
| 75.00000000000001 | 13.052 | -6.232 | -0.954 | 15.086 |
| 75.16734845667534 | 12.289 | -6.391 | -0.668 | 14.498 |
| 75.3346969133507 | 11.478 | -6.55 | -0.413 | 13.894 |
| 75.50204537002605 | 10.619 | -6.709 | -0.143 | 13.242 |
| 75.66939382670138 | 9.761 | -6.915 | 0.095 | 12.638 |
| 75.83674228337672 | 8.934 | -7.138 | 0.35 | 12.177 |
| 76.00409074005208 | 8.092 | -7.392 | 0.588 | 11.796 |
| 76.17143919672742 | 7.249 | -7.631 | 0.795 | 11.526 |
| 76.33878765340276 | 6.422 | -7.853 | 0.986 | 11.335 |
| 76.49683897359614 | 5.644 | -8.06 | 1.145 | 11.16 |
| 76.66418743027148 | 4.992 | -8.219 | 1.288 | 11.064 |
| 76.83153588694682 | 4.372 | -8.362 | 1.415 | 10.953 |
| 76.99888434362218 | 3.672 | -8.505 | 1.542 | 10.81 |
| 77.16623280029752 | 2.989 | -8.68 | 1.669 | 10.778 |
| 77.33358125697285 | 2.432 | -8.807 | 1.749 | 10.826 |
| 77.5009297136482 | 1.892 | -8.887 | 1.796 | 10.858 |
| 77.66827817032356 | 1.319 | -8.966 | 1.844 | 10.826 |
| 77.83562662699889 | 0.843 | -9.03 | 1.908 | 10.762 |
| 78.00297508367423 | 0.477 | -9.061 | 1.924 | 10.731 |
| 78.17032354034959 | 0.048 | -9.125 | 1.971 | 10.715 |
| 78.33767199702493 | -0.175 | -9.046 | 1.971 | 10.572 |
| 78.50502045370027 | -0.652 | -9.141 | 2.035 | 10.492 |
| 78.67236891037561 | -1.256 | -9.284 | 2.13 | 10.381 |
| 78.83042023056899 | -1.749 | -9.348 | 2.162 | 10.413 |
| 78.99776868724433 | -2.13 | -9.411 | 2.162 | 10.429 |
| 79.16511714391969 | -2.512 | -9.475 | 2.178 | 10.429 |
| 79.33246560059503 | -2.846 | -9.538 | 2.178 | 10.429 |
| 79.49981405727036 | -3.02 | -9.57 | 2.162 | 10.476 |
| 79.66716251394571 | -3.243 | -9.634 | 2.13 | 10.588 |
| 79.83451097062107 | -3.481 | -9.777 | 2.114 | 10.794 |
| 80.00185942729641 | -3.736 | -9.952 | 2.098 | 11.033 |
| 80.16920788397174 | -3.895 | -10.047 | 2.083 | 11.192 |
| 80.33655634064709 | -4.133 | -10.158 | 2.067 | 11.367 |
| 80.50390479732243 | -4.372 | -10.286 | 2.035 | 11.557 |
| 80.67125325399778 | -4.626 | -10.413 | 2.019 | 11.764 |
| 80.83860171067312 | -4.896 | -10.556 | 2.003 | 11.987 |
| 80.99665303086651 | -5.183 | -10.731 | 1.971 | 12.241 |
| 81.16400148754184 | -5.437 | -10.906 | 1.955 | 12.511 |
| 81.3313499442172 | -5.707 | -11.096 | 1.939 | 12.797 |
| 81.49869840089255 | -5.882 | -11.192 | 1.924 | 12.924 |
| 81.66604685756786 | -5.882 | -11.223 | 1.908 | 12.94 |
| 81.83339531424322 | -5.914 | -11.271 | 1.876 | 12.972 |
| 82.00074377091858 | -5.787 | -11.192 | 1.876 | 12.877 |
| 82.16809222759392 | -5.596 | -11.096 | 1.876 | 12.734 |
| 82.33544068426926 | -5.437 | -11.049 | 1.86 | 12.622 |
| 82.50278914094459 | -5.167 | -10.969 | 1.844 | 12.479 |
| 82.67013759761994 | -4.896 | -10.858 | 1.844 | 12.289 |
| 82.83748605429528 | -4.547 | -10.699 | 1.844 | 12.066 |
| 83.00483451097062 | -4.229 | -10.54 | 1.844 | 11.859 |
| 83.17218296764597 | -3.815 | -10.333 | 1.844 | 11.589 |
| 83.33023428783935 | -3.386 | -10.111 | 1.844 | 11.319 |
| 83.4975827445147 | -3.02 | -9.92 | 1.844 | 11.096 |
| 83.66493120119004 | -2.718 | -9.761 | 1.844 | 10.953 |
| 83.83227965786537 | -2.416 | -9.65 | 1.876 | 10.858 |
| 83.99962811454073 | -2.178 | -9.491 | 1.924 | 10.699 |
| 84.16697657121607 | -2.083 | -9.427 | 1.955 | 10.635 |
| 84.33432502789142 | -2.051 | -9.348 | 2.003 | 10.556 |
| 84.50167348456677 | -2.067 | -9.3 | 2.035 | 10.508 |
| 84.6690219412421 | -2.13 | -9.284 | 2.067 | 10.492 |
| 84.83637039791745 | -2.146 | -9.236 | 2.098 | 10.413 |
| 85.0037188545928 | -2.146 | -9.173 | 2.146 | 10.317 |
| 85.17106731126813 | -2.051 | -9.141 | 2.162 | 10.222 |
| 85.33841576794349 | -1.924 | -9.093 | 2.162 | 10.111 |
| 85.50576422461883 | -1.796 | -8.982 | 2.178 | 9.952 |
| 85.66381554481221 | -1.653 | -8.823 | 2.194 | 9.793 |
| 85.83116400148755 | -1.478 | -8.696 | 2.21 | 9.634 |
| 85.99851245816289 | -1.288 | -8.537 | 2.226 | 9.443 |
| 86.16586091483823 | -1.049 | -8.314 | 2.242 | 9.205 |
| 86.33320937151358 | -0.843 | -8.092 | 2.257 | 8.998 |
| 86.50055782818893 | -0.493 | -7.837 | 2.273 | 8.696 |
| 86.66790628486427 | -0.223 | -7.599 | 2.289 | 8.441 |
| 86.83525474153961 | 0 | -7.392 | 2.305 | 8.235 |
| 87.00260319821496 | 0.159 | -7.217 | 2.321 | 8.06 |
| 87.16995165489031 | 0.302 | -7.074 | 2.337 | 7.901 |
| 87.33730011156564 | 0.493 | -6.947 | 2.353 | 7.758 |
| 87.504648568241 | 0.652 | -6.82 | 2.385 | 7.615 |
| 87.67199702491634 | 0.763 | -6.693 | 2.416 | 7.488 |
| 87.83004834510972 | 0.763 | -6.629 | 2.448 | 7.424 |
| 87.99739680178506 | 0.811 | -6.566 | 2.496 | 7.36 |
| 88.1647452584604 | 0.699 | -6.534 | 2.528 | 7.329 |
| 88.33209371513574 | 0.572 | -6.502 | 2.575 | 7.297 |
| 88.49944217181108 | 0.493 | -6.454 | 2.591 | 7.249 |
| 88.66679062848644 | 0.382 | -6.407 | 2.623 | 7.201 |
| 88.83413908516178 | 0.302 | -6.343 | 2.639 | 7.138 |
| 89.00148754183712 | 0.286 | -6.2 | 2.671 | 7.027 |
| 89.16883599851246 | 0.286 | -6.041 | 2.687 | 6.868 |
| 89.33618445518782 | 0.382 | -5.898 | 2.703 | 6.756 |
| 89.50353291186315 | 0.429 | -5.739 | 2.718 | 6.645 |
| 89.6708813685385 | 0.477 | -5.548 | 2.734 | 6.534 |
| 89.83822982521386 | 0.572 | -5.31 | 2.734 | 6.375 |
| 90.00557828188919 | 0.668 | -5.071 | 2.75 | 6.2 |
| 90.16362960208257 | 0.811 | -4.817 | 2.766 | 6.009 |
| 90.3309780587579 | 0.89 | -4.61 | 2.766 | 5.85 |
| 90.49832651543326 | 0.97 | -4.404 | 2.782 | 5.707 |
| 90.66567497210859 | 1.017 | -4.181 | 2.798 | 5.564 |
| 90.83302342878395 | 1.017 | -4.022 | 2.83 | 5.437 |
| 91.00037188545929 | 0.986 | -3.879 | 2.846 | 5.326 |
| 91.16772034213463 | 0.874 | -3.799 | 2.846 | 5.278 |
| 91.33506879880998 | 0.715 | -3.752 | 2.862 | 5.262 |
| 91.50241725548533 | 0.525 | -3.704 | 2.909 | 5.262 |
| 91.66976571216065 | 0.207 | -3.72 | 2.941 | 5.262 |
| 91.83711416883601 | -0.048 | -3.704 | 2.973 | 5.246 |
| 92.00446262551137 | -0.238 | -3.672 | 2.989 | 5.246 |
| 92.1718110821867 | -0.429 | -3.625 | 2.989 | 5.246 |
| 92.33915953886203 | -0.652 | -3.593 | 3.005 | 5.278 |
| 92.49721085905541 | -0.827 | -3.561 | 3.02 | 5.326 |
| 92.66455931573077 | -1.002 | -3.513 | 3.02 | 5.341 |
| 92.83190777240611 | -1.145 | -3.45 | 3.02 | 5.357 |
| 92.99925622908145 | -1.304 | -3.386 | 3.02 | 5.373 |
| 93.1666046857568 | -1.431 | -3.307 | 3.02 | 5.341 |
| 93.33395314243214 | -1.415 | -3.148 | 3.036 | 5.262 |
| 93.50130159910749 | -1.383 | -2.925 | 3.052 | 5.119 |
| 93.66865005578283 | -1.351 | -2.703 | 3.068 | 5.024 |
| 93.83599851245818 | -1.272 | -2.464 | 3.084 | 4.96 |
| 94.00334696913353 | -1.129 | -2.194 | 3.084 | 4.849 |
| 94.17069542580886 | -0.986 | -1.924 | 3.084 | 4.769 |
| 94.3380438824842 | -0.858 | -1.701 | 3.1 | 4.69 |
| 94.50539233915954 | -0.731 | -1.478 | 3.116 | 4.594 |
| 94.66344365935292 | -0.652 | -1.288 | 3.132 | 4.531 |
| 94.83079211602828 | -0.62 | -1.145 | 3.148 | 4.467 |
| 94.99814057270362 | -0.604 | -1.002 | 3.148 | 4.451 |
| 95.16548902937897 | -0.636 | -0.906 | 3.164 | 4.419 |
| 95.33283748605432 | -0.699 | -0.795 | 3.164 | 4.372 |
| 95.50018594272963 | -0.763 | -0.699 | 3.164 | 4.324 |
| 95.66753439940499 | -0.811 | -0.62 | 3.164 | 4.292 |
| 95.83488285608034 | -0.858 | -0.525 | 3.179 | 4.276 |
| 96.00223131275567 | -0.906 | -0.477 | 3.195 | 4.276 |
| 96.16957976943102 | -0.986 | -0.429 | 3.211 | 4.292 |
| 96.33692822610638 | -1.081 | -0.397 | 3.227 | 4.324 |
| 96.50427668278171 | -1.224 | -0.382 | 3.227 | 4.372 |
| 96.67162513945706 | -1.383 | -0.366 | 3.243 | 4.419 |
| 96.8389735961324 | -1.542 | -0.35 | 3.259 | 4.499 |
| 96.99702491632577 | -1.717 | -0.382 | 3.275 | 4.594 |
| 97.16437337300111 | -1.939 | -0.413 | 3.291 | 4.721 |
| 97.33172182967647 | -2.242 | -0.477 | 3.291 | 4.849 |
| 97.49907028635181 | -2.464 | -0.525 | 3.323 | 4.976 |
| 97.66641874302715 | -2.734 | -0.62 | 3.338 | 5.167 |
| 97.8337671997025 | -3.005 | -0.731 | 3.354 | 5.357 |
| 98.00111565637785 | -3.243 | -0.827 | 3.37 | 5.516 |
| 98.16846411305319 | -3.37 | -0.858 | 3.402 | 5.596 |
| 98.33581256972855 | -3.545 | -0.874 | 3.402 | 5.723 |
| 98.50316102640389 | -3.656 | -0.874 | 3.402 | 5.802 |
| 98.67050948307921 | -3.688 | -0.827 | 3.418 | 5.802 |
| 98.83785793975456 | -3.736 | -0.763 | 3.434 | 5.802 |
| 99.0052063964299 | -3.752 | -0.699 | 3.434 | 5.818 |
| 99.17255485310525 | -3.784 | -0.652 | 3.45 | 5.818 |
| 99.33060617329863 | -3.815 | -0.62 | 3.45 | 5.818 |
| 99.49795462997399 | -3.863 | -0.588 | 3.466 | 5.834 |
| 99.66530308664933 | -3.927 | -0.572 | 3.481 | 5.866 |
| 99.83265154332467 | -4.006 | -0.556 | 3.481 | 5.898 |
| 100.0 | -4.086 | -0.556 | 3.497 | 5.946 |